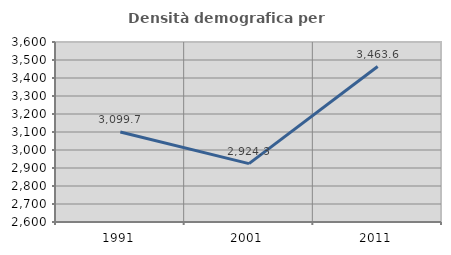
| Category | Densità demografica |
|---|---|
| 1991.0 | 3099.696 |
| 2001.0 | 2924.258 |
| 2011.0 | 3463.647 |